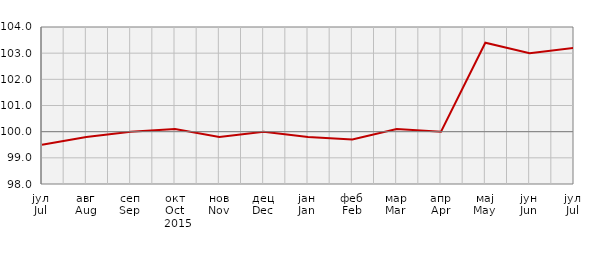
| Category | Индекси цијена произвођача
Producer price indices |
|---|---|
| јул
Jul | 99.5 |
| авг
Aug | 99.8 |
| сеп
Sep | 100 |
| окт
Oct | 100.1 |
| нов
Nov | 99.8 |
| дец
Dec | 100 |
| јан
Jan | 99.8 |
| феб
Feb | 99.7 |
| мар
Mar | 100.1 |
| апр
Apr | 100 |
| мај
May | 103.4 |
| јун
Jun | 103 |
| јул
Jul | 103.2 |